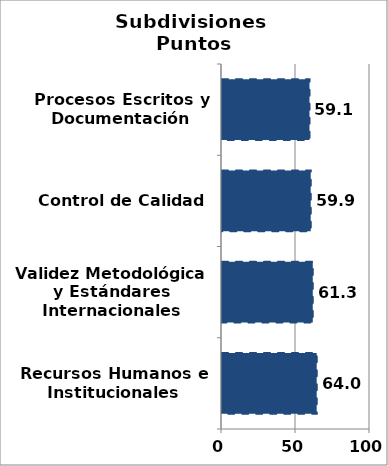
| Category | Series 0 |
|---|---|
| Recursos Humanos e Institucionales | 63.983 |
| Validez Metodológica y Estándares Internacionales | 61.332 |
| Control de Calidad | 59.947 |
| Procesos Escritos y Documentación | 59.109 |